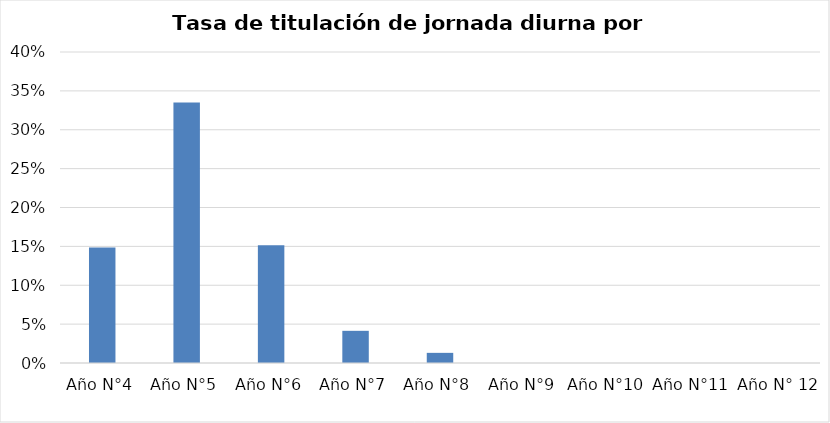
| Category | Series 0 |
|---|---|
| Año N°4 | 0.149 |
| Año N°5 | 0.335 |
| Año N°6 | 0.151 |
| Año N°7 | 0.041 |
| Año N°8 | 0.013 |
| Año N°9 | 0 |
| Año N°10 | 0 |
| Año N°11 | 0 |
| Año N° 12 | 0 |